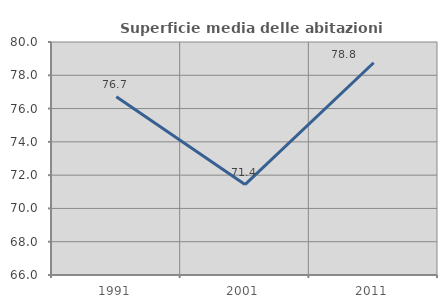
| Category | Superficie media delle abitazioni occupate |
|---|---|
| 1991.0 | 76.707 |
| 2001.0 | 71.433 |
| 2011.0 | 78.752 |